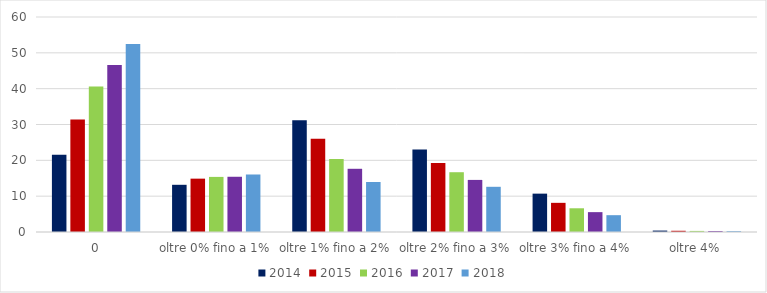
| Category | 2014 | 2015 | 2016 | 2017 | 2018 |
|---|---|---|---|---|---|
| 0 | 21.542 | 31.361 | 40.622 | 46.598 | 52.443 |
| oltre 0% fino a 1% | 13.173 | 14.889 | 15.377 | 15.415 | 16.049 |
| oltre 1% fino a 2% | 31.175 | 26.021 | 20.398 | 17.639 | 13.956 |
| oltre 2% fino a 3% | 23.005 | 19.251 | 16.683 | 14.536 | 12.614 |
| oltre 3% fino a 4% | 10.706 | 8.137 | 6.619 | 5.542 | 4.694 |
| oltre 4% | 0.398 | 0.341 | 0.301 | 0.271 | 0.245 |